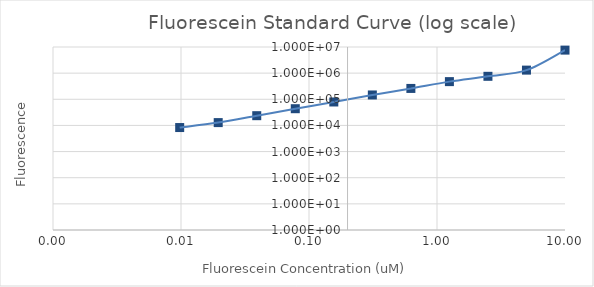
| Category | Series 1 |
|---|---|
| 10.0 | 7605601.25 |
| 5.0 | 1305235.75 |
| 2.5 | 756407.25 |
| 1.25 | 474005.75 |
| 0.625 | 260146.5 |
| 0.3125 | 146297.25 |
| 0.15625 | 78891.75 |
| 0.078125 | 43609.25 |
| 0.0390625 | 23591.25 |
| 0.01953125 | 12827 |
| 0.009765625 | 8301.75 |